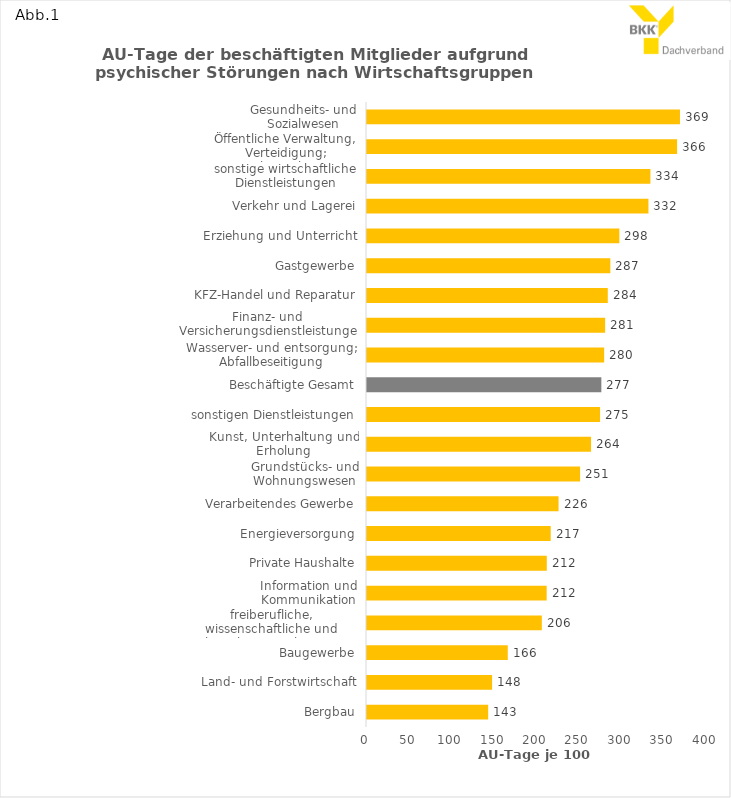
| Category | Series 0 |
|---|---|
| Bergbau | 142.98 |
| Land- und Forstwirtschaft | 147.59 |
| Baugewerbe | 166.1 |
| freiberufliche, wissenschaftliche und technische Dienstleistungen | 206.29 |
| Information und Kommunikation | 212 |
| Private Haushalte | 212.15 |
| Energieversorgung | 216.77 |
| Verarbeitendes Gewerbe | 226.03 |
| Grundstücks- und Wohnungswesen | 251.44 |
| Kunst, Unterhaltung und Erholung | 264.36 |
| sonstigen Dienstleistungen | 275.03 |
| Beschäftigte Gesamt | 276.51 |
| Wasserver- und entsorgung; Abfallbeseitigung | 279.84 |
| Finanz- und Versicherungsdienstleistungen | 280.98 |
| KFZ-Handel und Reparatur | 284.12 |
| Gastgewerbe | 287.12 |
| Erziehung und Unterricht | 297.74 |
| Verkehr und Lagerei | 332.09 |
| sonstige wirtschaftliche Dienstleistungen | 334.4 |
| Öffentliche Verwaltung, Verteidigung; Sozialversicherung | 365.89 |
| Gesundheits- und Sozialwesen | 369.3 |